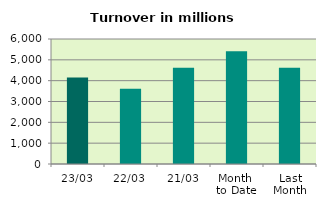
| Category | Series 0 |
|---|---|
| 23/03 | 4156.604 |
| 22/03 | 3615.765 |
| 21/03 | 4620.011 |
| Month 
to Date | 5416.888 |
| Last
Month | 4623.097 |